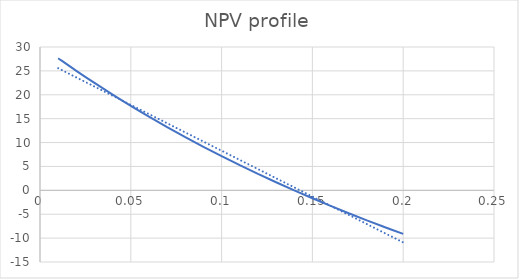
| Category | NPV profile |
|---|---|
| 0.01 | 27.655 |
| 0.02 | 25.016 |
| 0.03 | 22.479 |
| 0.04 | 20.037 |
| 0.05 | 17.687 |
| 0.06 | 15.423 |
| 0.07 | 13.242 |
| 0.08 | 11.14 |
| 0.09 | 9.112 |
| 0.1 | 7.156 |
| 0.11 | 5.268 |
| 0.12 | 3.446 |
| 0.13 | 1.685 |
| 0.14 | -0.016 |
| 0.15 | -1.661 |
| 0.16 | -3.251 |
| 0.17 | -4.789 |
| 0.18 | -6.278 |
| 0.19 | -7.72 |
| 0.2 | -9.115 |